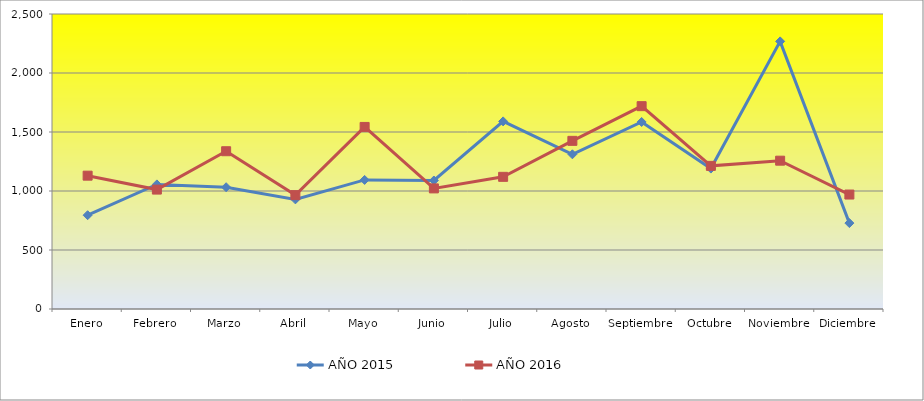
| Category | AÑO 2015 | AÑO 2016 |
|---|---|---|
| Enero | 795 | 1130 |
| Febrero | 1056 | 1012 |
| Marzo | 1032 | 1337 |
| Abril | 929 | 965 |
| Mayo | 1094 | 1543 |
| Junio | 1089 | 1022 |
| Julio | 1590 | 1120 |
| Agosto | 1311 | 1425 |
| Septiembre | 1585 | 1719 |
| Octubre | 1190 | 1213 |
| Noviembre | 2268 | 1257 |
| Diciembre | 728 | 970 |